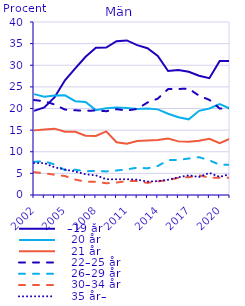
| Category |   –19 år |    20 år |    21 år |    22–25 år |    26–29 år |    30–34 år |    35 år– |
|---|---|---|---|---|---|---|---|
| 2002.0 | 19.441 | 23.321 | 14.942 | 21.956 | 7.679 | 5.279 | 7.382 |
| 2003.0 | 20.239 | 22.747 | 15.142 | 21.678 | 7.801 | 5.016 | 7.377 |
| 2004.0 | 22.612 | 22.989 | 15.34 | 20.925 | 7.058 | 4.686 | 6.39 |
| 2005.0 | 26.512 | 23.061 | 14.643 | 19.75 | 5.747 | 4.389 | 5.896 |
| 2006.0 | 29.259 | 21.695 | 14.612 | 19.591 | 5.844 | 3.568 | 5.431 |
| 2007.0 | 31.967 | 21.484 | 13.715 | 19.469 | 5.5 | 3.078 | 4.787 |
| 2008.0 | 34.022 | 19.625 | 13.651 | 19.531 | 5.57 | 3.064 | 4.538 |
| 2009.0 | 34.078 | 20.032 | 14.699 | 19.375 | 5.451 | 2.718 | 3.647 |
| 2010.0 | 35.57 | 20.203 | 12.208 | 19.836 | 5.671 | 2.878 | 3.633 |
| 2011.0 | 35.732 | 20.105 | 11.838 | 19.528 | 5.931 | 3.215 | 3.652 |
| 2012.0 | 34.661 | 19.872 | 12.491 | 19.907 | 6.311 | 3.213 | 3.546 |
| 2013.0 | 33.929 | 20.019 | 12.606 | 21.382 | 6.176 | 2.798 | 3.09 |
| 2014.0 | 32.132 | 19.797 | 12.714 | 22.279 | 6.704 | 3.153 | 3.22 |
| 2015.0 | 28.682 | 18.791 | 13.034 | 24.49 | 8.057 | 3.428 | 3.518 |
| 2016.0 | 28.911 | 17.992 | 12.399 | 24.518 | 8.108 | 3.977 | 4.096 |
| 2017.0 | 28.5 | 17.498 | 12.303 | 24.589 | 8.439 | 4.123 | 4.549 |
| 2018.0 | 27.568 | 19.463 | 12.543 | 22.959 | 8.748 | 4.559 | 4.16 |
| 2019.0 | 27 | 20 | 13 | 22 | 8 | 4 | 5.115 |
| 2020.0 | 31 | 21 | 12 | 20 | 7 | 4 | 4.182 |
| 2021.0 | 31 | 20 | 13 | 20 | 7 | 4 | 4.84 |